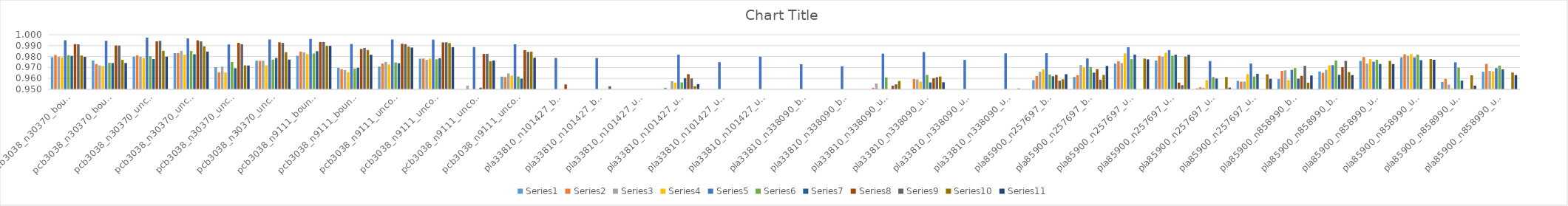
| Category | Series 0 | Series 1 | Series 2 | Series 3 | Series 4 | Series 5 | Series 6 | Series 7 | Series 8 | Series 9 | Series 10 |
|---|---|---|---|---|---|---|---|---|---|---|---|
| pcb3038_n30370_bounded-strongly-corr_03.ttp | 0.979 | 0.982 | 0.98 | 0.979 | 0.995 | 0.981 | 0.981 | 0.991 | 0.991 | 0.981 | 0.98 |
| pcb3038_n30370_bounded-strongly-corr_07.ttp | 0.976 | 0.973 | 0.972 | 0.971 | 0.994 | 0.974 | 0.974 | 0.99 | 0.99 | 0.977 | 0.974 |
| pcb3038_n30370_uncorr_03.ttp | 0.98 | 0.981 | 0.98 | 0.979 | 0.997 | 0.98 | 0.978 | 0.994 | 0.994 | 0.985 | 0.98 |
| pcb3038_n30370_uncorr_07.ttp | 0.983 | 0.983 | 0.985 | 0.982 | 0.997 | 0.985 | 0.982 | 0.995 | 0.994 | 0.989 | 0.985 |
| pcb3038_n30370_uncorr-similar-weights_03.ttp | 0.97 | 0.966 | 0.971 | 0.965 | 0.991 | 0.975 | 0.969 | 0.992 | 0.991 | 0.972 | 0.972 |
| pcb3038_n30370_uncorr-similar-weights_07.ttp | 0.976 | 0.976 | 0.976 | 0.972 | 0.996 | 0.977 | 0.979 | 0.993 | 0.992 | 0.984 | 0.977 |
| pcb3038_n9111_bounded-strongly-corr_03.ttp | 0.981 | 0.985 | 0.984 | 0.982 | 0.996 | 0.983 | 0.985 | 0.993 | 0.993 | 0.99 | 0.99 |
| pcb3038_n9111_bounded-strongly-corr_07.ttp | 0.97 | 0.968 | 0.968 | 0.966 | 0.992 | 0.969 | 0.97 | 0.987 | 0.988 | 0.986 | 0.982 |
| pcb3038_n9111_uncorr_03.ttp | 0.971 | 0.974 | 0.975 | 0.973 | 0.996 | 0.975 | 0.974 | 0.992 | 0.991 | 0.989 | 0.988 |
| pcb3038_n9111_uncorr_07.ttp | 0.978 | 0.978 | 0.977 | 0.978 | 0.995 | 0.977 | 0.979 | 0.993 | 0.993 | 0.992 | 0.989 |
| pcb3038_n9111_uncorr-similar-weights_03.ttp | 0.948 | 0.949 | 0.953 | 0.95 | 0.989 | 0.948 | 0.952 | 0.982 | 0.983 | 0.976 | 0.976 |
| pcb3038_n9111_uncorr-similar-weights_07.ttp | 0.962 | 0.961 | 0.965 | 0.963 | 0.991 | 0.962 | 0.96 | 0.986 | 0.984 | 0.985 | 0.979 |
| pla33810_n101427_bounded-strongly-corr_03.ttp | 0.913 | 0.924 | 0.932 | 0.929 | 0.979 | 0.926 | 0.935 | 0.955 | 0.94 | 0.939 | 0.92 |
| pla33810_n101427_bounded-strongly-corr_07.ttp | 0.91 | 0.919 | 0.924 | 0.925 | 0.979 | 0.924 | 0.93 | 0.942 | 0.953 | 0.938 | 0.917 |
| pla33810_n101427_uncorr_03.ttp | 0.706 | 0.708 | 0.714 | 0.714 | 0.735 | 0.707 | 0.713 | 0.714 | 0.715 | 0.712 | 0.709 |
| pla33810_n101427_uncorr_07.ttp | 0.951 | 0.948 | 0.957 | 0.956 | 0.982 | 0.956 | 0.96 | 0.964 | 0.96 | 0.953 | 0.955 |
| pla33810_n101427_uncorr-similar-weights_03.ttp | 0.904 | 0.924 | 0.918 | 0.924 | 0.975 | 0.916 | 0.922 | 0.937 | 0.933 | 0.925 | 0.918 |
| pla33810_n101427_uncorr-similar-weights_07.ttp | 0.922 | 0.926 | 0.943 | 0.936 | 0.98 | 0.929 | 0.939 | 0.947 | 0.939 | 0.939 | 0.935 |
| pla33810_n338090_bounded-strongly-corr_03.ttp | 0.922 | 0.917 | 0.932 | 0.934 | 0.973 | 0.935 | 0.924 | 0.938 | 0.933 | 0.925 | 0.924 |
| pla33810_n338090_bounded-strongly-corr_07.ttp | 0.926 | 0.924 | 0.934 | 0.929 | 0.971 | 0.943 | 0.924 | 0.949 | 0.943 | 0.926 | 0.933 |
| pla33810_n338090_uncorr_03.ttp | 0.947 | 0.951 | 0.955 | 0.95 | 0.983 | 0.961 | 0.948 | 0.953 | 0.955 | 0.958 | 0.95 |
| pla33810_n338090_uncorr_07.ttp | 0.95 | 0.96 | 0.959 | 0.957 | 0.984 | 0.963 | 0.956 | 0.96 | 0.961 | 0.962 | 0.957 |
| pla33810_n338090_uncorr-similar-weights_03.ttp | 0.913 | 0.918 | 0.922 | 0.92 | 0.977 | 0.933 | 0.92 | 0.935 | 0.928 | 0.921 | 0.923 |
| pla33810_n338090_uncorr-similar-weights_07.ttp | 0.939 | 0.944 | 0.943 | 0.941 | 0.983 | 0.949 | 0.936 | 0.944 | 0.951 | 0.941 | 0.946 |
| pla85900_n257697_bounded-strongly-corr_03.ttp | 0.958 | 0.962 | 0.966 | 0.968 | 0.983 | 0.964 | 0.962 | 0.963 | 0.958 | 0.959 | 0.964 |
| pla85900_n257697_bounded-strongly-corr_07.ttp | 0.961 | 0.963 | 0.972 | 0.97 | 0.978 | 0.97 | 0.965 | 0.968 | 0.959 | 0.963 | 0.971 |
| pla85900_n257697_uncorr_03.ttp | 0.974 | 0.976 | 0.974 | 0.983 | 0.989 | 0.978 | 0.982 | 0.942 | 0.941 | 0.978 | 0.977 |
| pla85900_n257697_uncorr_07.ttp | 0.976 | 0.981 | 0.98 | 0.984 | 0.986 | 0.981 | 0.982 | 0.956 | 0.954 | 0.98 | 0.982 |
| pla85900_n257697_uncorr-similar-weights_03.ttp | 0.951 | 0.952 | 0.952 | 0.958 | 0.976 | 0.961 | 0.96 | 0.926 | 0.923 | 0.961 | 0.952 |
| pla85900_n257697_uncorr-similar-weights_07.ttp | 0.958 | 0.957 | 0.957 | 0.964 | 0.974 | 0.962 | 0.964 | 0.934 | 0.933 | 0.964 | 0.96 |
| pla85900_n858990_bounded-strongly-corr_03.ttp | 0.959 | 0.967 | 0.967 | 0.958 | 0.968 | 0.969 | 0.96 | 0.962 | 0.971 | 0.956 | 0.963 |
| pla85900_n858990_bounded-strongly-corr_07.ttp | 0.966 | 0.965 | 0.968 | 0.972 | 0.972 | 0.976 | 0.963 | 0.97 | 0.976 | 0.966 | 0.963 |
| pla85900_n858990_uncorr_03.ttp | 0.976 | 0.98 | 0.974 | 0.978 | 0.975 | 0.977 | 0.973 | 0.921 | 0.92 | 0.976 | 0.973 |
| pla85900_n858990_uncorr_07.ttp | 0.979 | 0.982 | 0.981 | 0.982 | 0.979 | 0.982 | 0.977 | 0.946 | 0.945 | 0.978 | 0.977 |
| pla85900_n858990_uncorr-similar-weights_03.ttp | 0.957 | 0.96 | 0.954 | 0.951 | 0.975 | 0.97 | 0.958 | 0.918 | 0.927 | 0.963 | 0.953 |
| pla85900_n858990_uncorr-similar-weights_07.ttp | 0.966 | 0.973 | 0.967 | 0.966 | 0.969 | 0.972 | 0.968 | 0.932 | 0.932 | 0.965 | 0.963 |